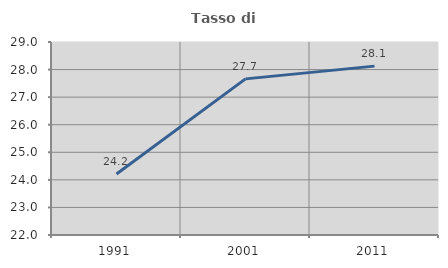
| Category | Tasso di occupazione   |
|---|---|
| 1991.0 | 24.214 |
| 2001.0 | 27.662 |
| 2011.0 | 28.125 |